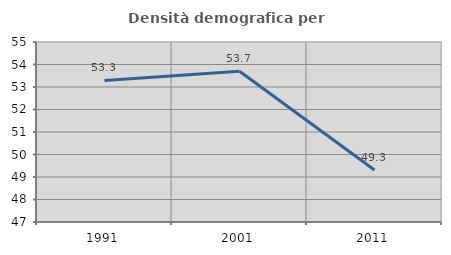
| Category | Densità demografica |
|---|---|
| 1991.0 | 53.29 |
| 2001.0 | 53.697 |
| 2011.0 | 49.31 |